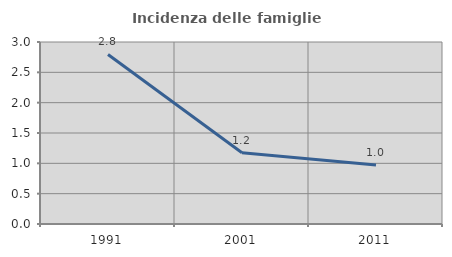
| Category | Incidenza delle famiglie numerose |
|---|---|
| 1991.0 | 2.794 |
| 2001.0 | 1.174 |
| 2011.0 | 0.974 |